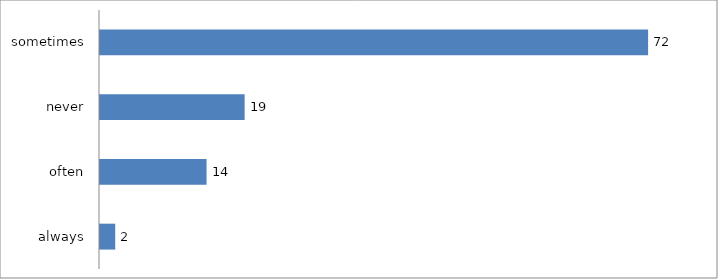
| Category | Series 0 |
|---|---|
| always | 2 |
| often | 14 |
| never | 19 |
| sometimes | 72 |